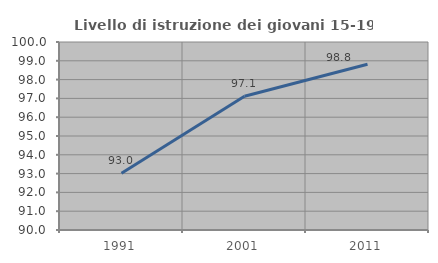
| Category | Livello di istruzione dei giovani 15-19 anni |
|---|---|
| 1991.0 | 93.018 |
| 2001.0 | 97.115 |
| 2011.0 | 98.818 |